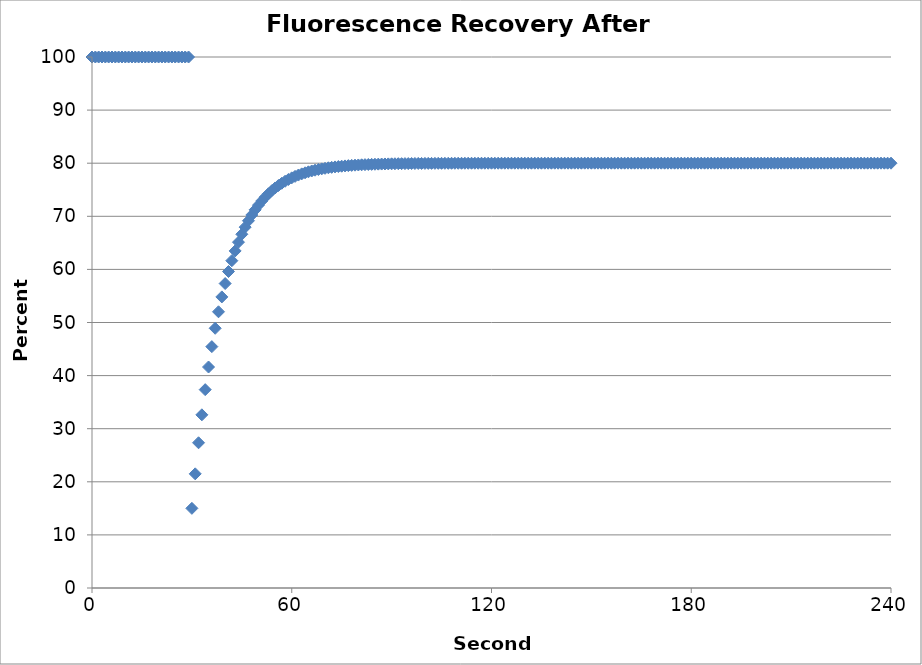
| Category | Series 0 |
|---|---|
| 0.0 | 100 |
| 1.0 | 100 |
| 2.0 | 100 |
| 3.0 | 100 |
| 4.0 | 100 |
| 5.0 | 100 |
| 6.0 | 100 |
| 7.0 | 100 |
| 8.0 | 100 |
| 9.0 | 100 |
| 10.0 | 100 |
| 11.0 | 100 |
| 12.0 | 100 |
| 13.0 | 100 |
| 14.0 | 100 |
| 15.0 | 100 |
| 16.0 | 100 |
| 17.0 | 100 |
| 18.0 | 100 |
| 19.0 | 100 |
| 20.0 | 100 |
| 21.0 | 100 |
| 22.0 | 100 |
| 23.0 | 100 |
| 24.0 | 100 |
| 25.0 | 100 |
| 26.0 | 100 |
| 27.0 | 100 |
| 28.0 | 100 |
| 29.0 | 100 |
| 30.0 | 15 |
| 31.0 | 21.5 |
| 32.0 | 27.35 |
| 33.0 | 32.615 |
| 34.0 | 37.354 |
| 35.0 | 41.618 |
| 36.0 | 45.456 |
| 37.0 | 48.911 |
| 38.0 | 52.02 |
| 39.0 | 54.818 |
| 40.0 | 57.336 |
| 41.0 | 59.602 |
| 42.0 | 61.642 |
| 43.0 | 63.478 |
| 44.0 | 65.13 |
| 45.0 | 66.617 |
| 46.0 | 67.955 |
| 47.0 | 69.16 |
| 48.0 | 70.244 |
| 49.0 | 71.219 |
| 50.0 | 72.098 |
| 51.0 | 72.888 |
| 52.0 | 73.599 |
| 53.0 | 74.239 |
| 54.0 | 74.815 |
| 55.0 | 75.334 |
| 56.0 | 75.8 |
| 57.0 | 76.22 |
| 58.0 | 76.598 |
| 59.0 | 76.938 |
| 60.0 | 77.245 |
| 61.0 | 77.52 |
| 62.0 | 77.768 |
| 63.0 | 77.991 |
| 64.0 | 78.192 |
| 65.0 | 78.373 |
| 66.0 | 78.536 |
| 67.0 | 78.682 |
| 68.0 | 78.814 |
| 69.0 | 78.932 |
| 70.0 | 79.039 |
| 71.0 | 79.135 |
| 72.0 | 79.222 |
| 73.0 | 79.3 |
| 74.0 | 79.37 |
| 75.0 | 79.433 |
| 76.0 | 79.489 |
| 77.0 | 79.54 |
| 78.0 | 79.586 |
| 79.0 | 79.628 |
| 80.0 | 79.665 |
| 81.0 | 79.699 |
| 82.0 | 79.729 |
| 83.0 | 79.756 |
| 84.0 | 79.78 |
| 85.0 | 79.802 |
| 86.0 | 79.822 |
| 87.0 | 79.84 |
| 88.0 | 79.856 |
| 89.0 | 79.87 |
| 90.0 | 79.883 |
| 91.0 | 79.895 |
| 92.0 | 79.905 |
| 93.0 | 79.915 |
| 94.0 | 79.923 |
| 95.0 | 79.931 |
| 96.0 | 79.938 |
| 97.0 | 79.944 |
| 98.0 | 79.95 |
| 99.0 | 79.955 |
| 100.0 | 79.959 |
| 101.0 | 79.963 |
| 102.0 | 79.967 |
| 103.0 | 79.97 |
| 104.0 | 79.973 |
| 105.0 | 79.976 |
| 106.0 | 79.978 |
| 107.0 | 79.981 |
| 108.0 | 79.982 |
| 109.0 | 79.984 |
| 110.0 | 79.986 |
| 111.0 | 79.987 |
| 112.0 | 79.988 |
| 113.0 | 79.99 |
| 114.0 | 79.991 |
| 115.0 | 79.992 |
| 116.0 | 79.992 |
| 117.0 | 79.993 |
| 118.0 | 79.994 |
| 119.0 | 79.994 |
| 120.0 | 79.995 |
| 121.0 | 79.996 |
| 122.0 | 79.996 |
| 123.0 | 79.996 |
| 124.0 | 79.997 |
| 125.0 | 79.997 |
| 126.0 | 79.997 |
| 127.0 | 79.998 |
| 128.0 | 79.998 |
| 129.0 | 79.998 |
| 130.0 | 79.998 |
| 131.0 | 79.998 |
| 132.0 | 79.999 |
| 133.0 | 79.999 |
| 134.0 | 79.999 |
| 135.0 | 79.999 |
| 136.0 | 79.999 |
| 137.0 | 79.999 |
| 138.0 | 79.999 |
| 139.0 | 79.999 |
| 140.0 | 79.999 |
| 141.0 | 79.999 |
| 142.0 | 80 |
| 143.0 | 80 |
| 144.0 | 80 |
| 145.0 | 80 |
| 146.0 | 80 |
| 147.0 | 80 |
| 148.0 | 80 |
| 149.0 | 80 |
| 150.0 | 80 |
| 151.0 | 80 |
| 152.0 | 80 |
| 153.0 | 80 |
| 154.0 | 80 |
| 155.0 | 80 |
| 156.0 | 80 |
| 157.0 | 80 |
| 158.0 | 80 |
| 159.0 | 80 |
| 160.0 | 80 |
| 161.0 | 80 |
| 162.0 | 80 |
| 163.0 | 80 |
| 164.0 | 80 |
| 165.0 | 80 |
| 166.0 | 80 |
| 167.0 | 80 |
| 168.0 | 80 |
| 169.0 | 80 |
| 170.0 | 80 |
| 171.0 | 80 |
| 172.0 | 80 |
| 173.0 | 80 |
| 174.0 | 80 |
| 175.0 | 80 |
| 176.0 | 80 |
| 177.0 | 80 |
| 178.0 | 80 |
| 179.0 | 80 |
| 180.0 | 80 |
| 181.0 | 80 |
| 182.0 | 80 |
| 183.0 | 80 |
| 184.0 | 80 |
| 185.0 | 80 |
| 186.0 | 80 |
| 187.0 | 80 |
| 188.0 | 80 |
| 189.0 | 80 |
| 190.0 | 80 |
| 191.0 | 80 |
| 192.0 | 80 |
| 193.0 | 80 |
| 194.0 | 80 |
| 195.0 | 80 |
| 196.0 | 80 |
| 197.0 | 80 |
| 198.0 | 80 |
| 199.0 | 80 |
| 200.0 | 80 |
| 201.0 | 80 |
| 202.0 | 80 |
| 203.0 | 80 |
| 204.0 | 80 |
| 205.0 | 80 |
| 206.0 | 80 |
| 207.0 | 80 |
| 208.0 | 80 |
| 209.0 | 80 |
| 210.0 | 80 |
| 211.0 | 80 |
| 212.0 | 80 |
| 213.0 | 80 |
| 214.0 | 80 |
| 215.0 | 80 |
| 216.0 | 80 |
| 217.0 | 80 |
| 218.0 | 80 |
| 219.0 | 80 |
| 220.0 | 80 |
| 221.0 | 80 |
| 222.0 | 80 |
| 223.0 | 80 |
| 224.0 | 80 |
| 225.0 | 80 |
| 226.0 | 80 |
| 227.0 | 80 |
| 228.0 | 80 |
| 229.0 | 80 |
| 230.0 | 80 |
| 231.0 | 80 |
| 232.0 | 80 |
| 233.0 | 80 |
| 234.0 | 80 |
| 235.0 | 80 |
| 236.0 | 80 |
| 237.0 | 80 |
| 238.0 | 80 |
| 239.0 | 80 |
| 240.0 | 80 |